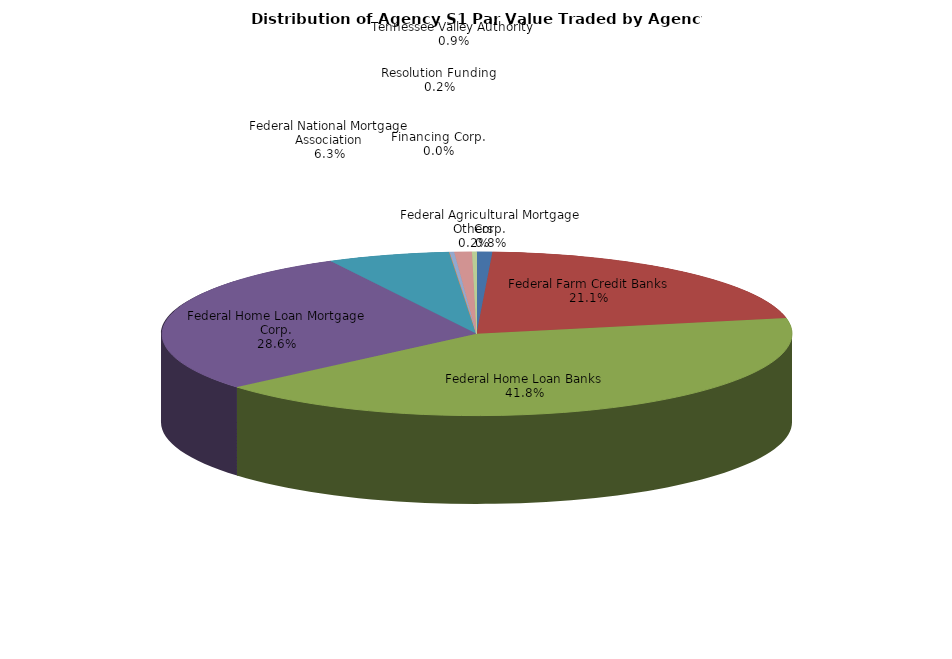
| Category | Series 0 |
|---|---|
| Federal Agricultural Mortgage Corp. | 31581747.479 |
| Federal Farm Credit Banks | 827007900 |
| Federal Home Loan Banks | 1638720975.898 |
| Federal Home Loan Mortgage Corp. | 1122662816.398 |
| Federal National Mortgage Association | 245829366.788 |
| Financing Corp. | 0 |
| Resolution Funding | 9262884 |
| Tennessee Valley Authority | 35143823.087 |
| Others | 9006097.566 |